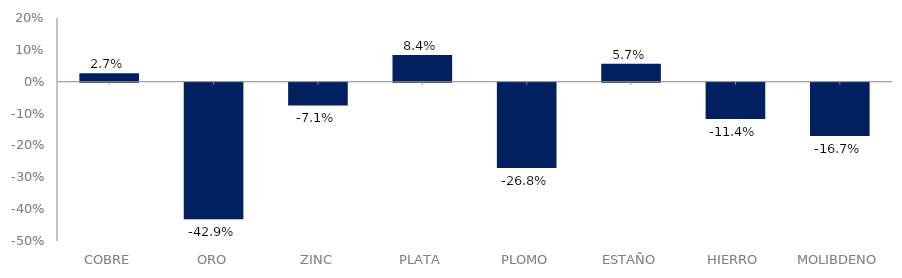
| Category | Series 0 |
|---|---|
| COBRE | 0.027 |
| ORO | -0.429 |
| ZINC | -0.071 |
| PLATA | 0.084 |
| PLOMO | -0.268 |
| ESTAÑO | 0.057 |
| HIERRO | -0.114 |
| MOLIBDENO | -0.167 |